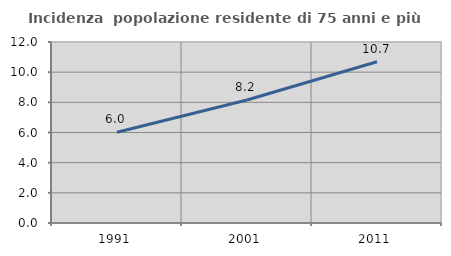
| Category | Incidenza  popolazione residente di 75 anni e più |
|---|---|
| 1991.0 | 6.016 |
| 2001.0 | 8.153 |
| 2011.0 | 10.692 |